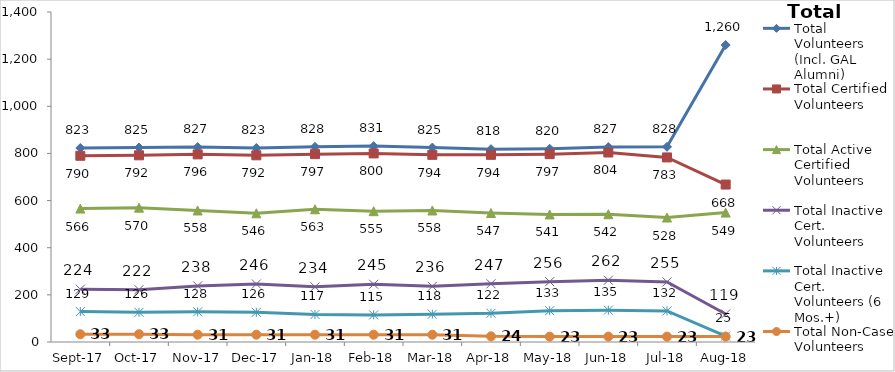
| Category | Total Volunteers (Incl. GAL Alumni) | Total Certified Volunteers | Total Active Certified Volunteers | Total Inactive Cert. Volunteers | Total Inactive Cert. Volunteers (6 Mos.+) | Total Non-Case Volunteers |
|---|---|---|---|---|---|---|
| 2017-09-01 | 823 | 790 | 566 | 224 | 129 | 33 |
| 2017-10-01 | 825 | 792 | 570 | 222 | 126 | 33 |
| 2017-11-01 | 827 | 796 | 558 | 238 | 128 | 31 |
| 2017-12-01 | 823 | 792 | 546 | 246 | 126 | 31 |
| 2018-01-01 | 828 | 797 | 563 | 234 | 117 | 31 |
| 2018-02-01 | 831 | 800 | 555 | 245 | 115 | 31 |
| 2018-03-01 | 825 | 794 | 558 | 236 | 118 | 31 |
| 2018-04-01 | 818 | 794 | 547 | 247 | 122 | 24 |
| 2018-05-01 | 820 | 797 | 541 | 256 | 133 | 23 |
| 2018-06-01 | 827 | 804 | 542 | 262 | 135 | 23 |
| 2018-07-01 | 828 | 783 | 528 | 255 | 132 | 23 |
| 2018-08-01 | 1260 | 668 | 549 | 119 | 25 | 23 |